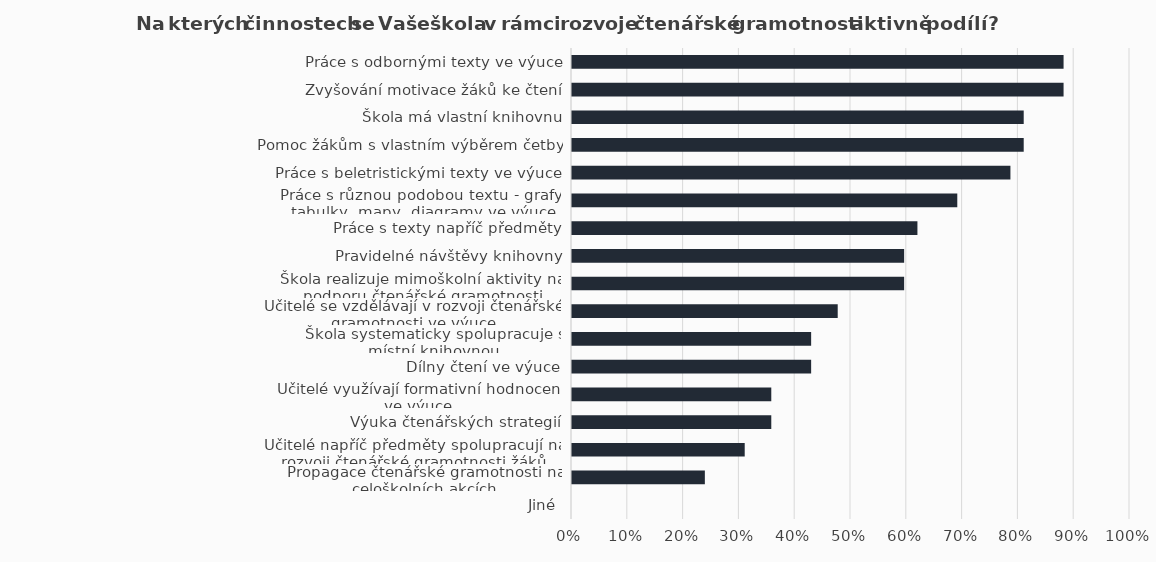
| Category | Series 1 |
|---|---|
| Práce s odbornými texty ve výuce | 0.881 |
| Zvyšování motivace žáků ke čtení | 0.881 |
| Škola má vlastní knihovnu | 0.81 |
| Pomoc žákům s vlastním výběrem četby | 0.81 |
| Práce s beletristickými texty ve výuce | 0.786 |
| Práce s různou podobou textu - grafy, tabulky, mapy, diagramy ve výuce | 0.69 |
| Práce s texty napříč předměty | 0.619 |
| Pravidelné návštěvy knihovny | 0.595 |
| Škola realizuje mimoškolní aktivity na podporu čtenářské gramotnosti | 0.595 |
| Učitelé se vzdělávají v rozvoji čtenářské gramotnosti ve výuce | 0.476 |
| Škola systematicky spolupracuje s místní knihovnou | 0.429 |
| Dílny čtení ve výuce | 0.429 |
| Učitelé využívají formativní hodnocení ve výuce | 0.357 |
| Výuka čtenářských strategií | 0.357 |
| Učitelé napříč předměty spolupracují na rozvoji čtenářské gramotnosti žáků | 0.31 |
| Propagace čtenářské gramotnosti na celoškolních akcích | 0.238 |
| Jiné | 0 |